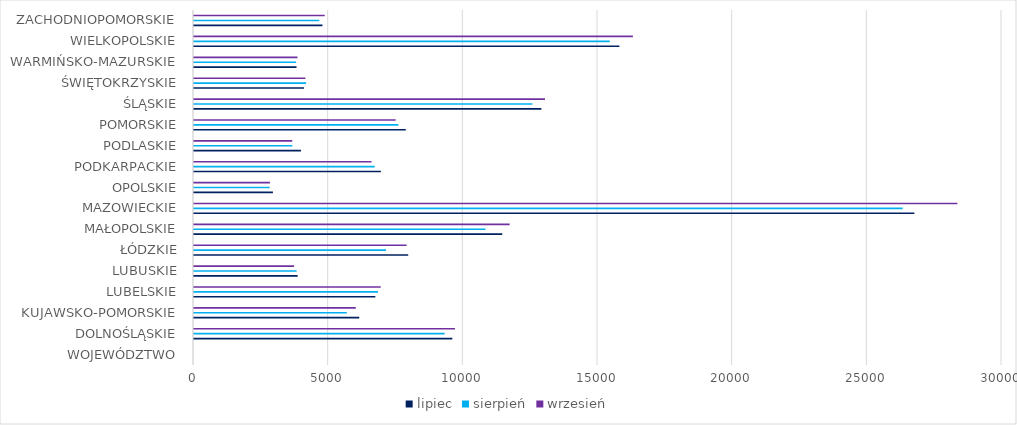
| Category | Series 0 | Series 1 | lipiec | Series 3 | Series 4 | sierpień | Series 6 | Series 7 | wrzesień | Series 9 | Series 10 |
|---|---|---|---|---|---|---|---|---|---|---|---|
| WOJEWÓDZTWO |  |  | 0 |  |  | 0 |  |  | 0 |  |  |
| DOLNOŚLĄSKIE |  |  | 9591 |  |  | 9305 |  |  | 9689 |  |  |
| KUJAWSKO-POMORSKIE |  |  | 6135 |  |  | 5673 |  |  | 6006 |  |  |
| LUBELSKIE |  |  | 6734 |  |  | 6831 |  |  | 6933 |  |  |
| LUBUSKIE |  |  | 3849 |  |  | 3810 |  |  | 3717 |  |  |
| ŁÓDZKIE |  |  | 7954 |  |  | 7128 |  |  | 7893 |  |  |
| MAŁOPOLSKIE |  |  | 11445 |  |  | 10824 |  |  | 11719 |  |  |
| MAZOWIECKIE |  |  | 26746 |  |  | 26313 |  |  | 28344 |  |  |
| OPOLSKIE |  |  | 2931 |  |  | 2808 |  |  | 2818 |  |  |
| PODKARPACKIE |  |  | 6940 |  |  | 6709 |  |  | 6591 |  |  |
| PODLASKIE |  |  | 3971 |  |  | 3652 |  |  | 3648 |  |  |
| POMORSKIE |  |  | 7864 |  |  | 7590 |  |  | 7489 |  |  |
| ŚLĄSKIE |  |  | 12898 |  |  | 12566 |  |  | 13031 |  |  |
| ŚWIĘTOKRZYSKIE |  |  | 4086 |  |  | 4162 |  |  | 4136 |  |  |
| WARMIŃSKO-MAZURSKIE |  |  | 3806 |  |  | 3792 |  |  | 3842 |  |  |
| WIELKOPOLSKIE |  |  | 15795 |  |  | 15437 |  |  | 16295 |  |  |
| ZACHODNIOPOMORSKIE |  |  | 4770 |  |  | 4651 |  |  | 4855 |  |  |